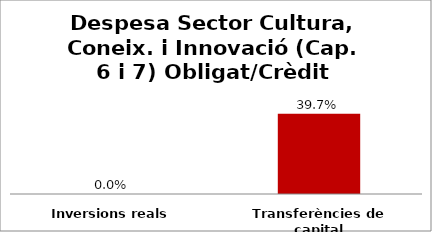
| Category | Series 0 |
|---|---|
| Inversions reals | 0 |
| Transferències de capital | 0.397 |